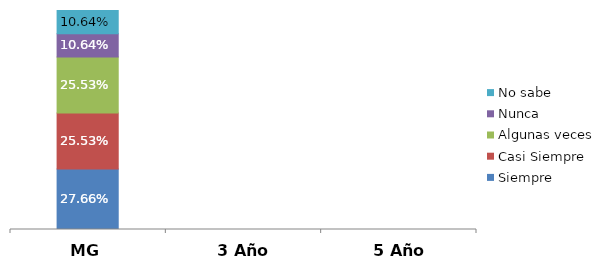
| Category | Siempre | Casi Siempre | Algunas veces | Nunca | No sabe |
|---|---|---|---|---|---|
| MG | 0.277 | 0.255 | 0.255 | 0.106 | 0.106 |
| 3 Año | 0 | 0 | 0 | 0 | 0 |
| 5 Año | 0 | 0 | 0 | 0 | 0 |